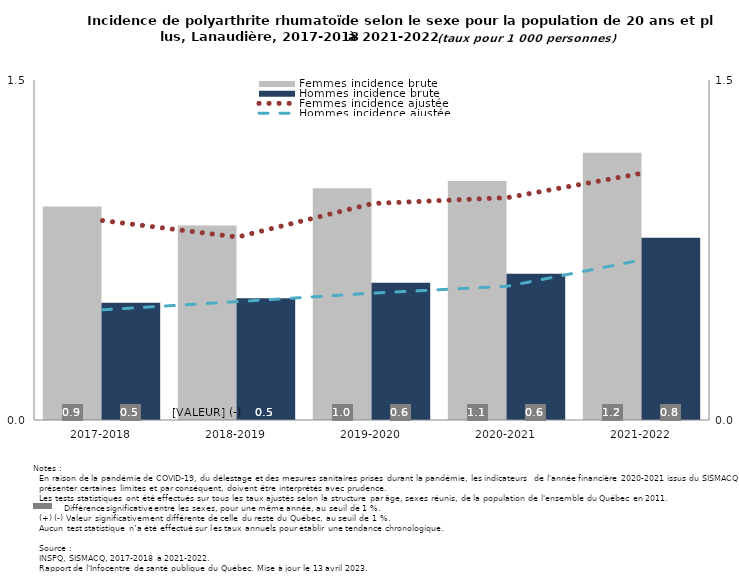
| Category | Femmes incidence brute | Hommes incidence brute |
|---|---|---|
| 2017-2018 | 0.942 | 0.517 |
| 2018-2019 | 0.858 | 0.537 |
| 2019-2020 | 1.022 | 0.605 |
| 2020-2021 | 1.054 | 0.645 |
| 2021-2022 | 1.18 | 0.804 |